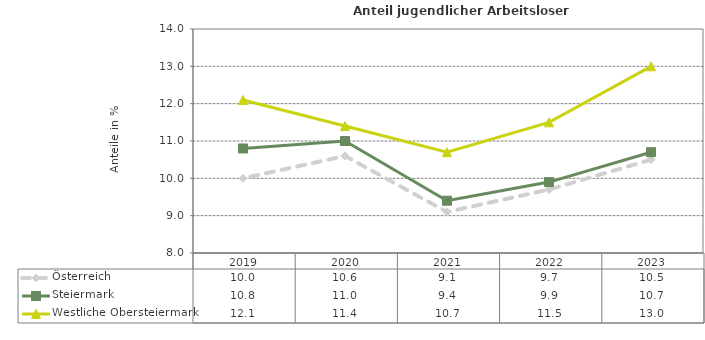
| Category | Österreich | Steiermark | Westliche Obersteiermark |
|---|---|---|---|
| 2023.0 | 10.5 | 10.7 | 13 |
| 2022.0 | 9.7 | 9.9 | 11.5 |
| 2021.0 | 9.1 | 9.4 | 10.7 |
| 2020.0 | 10.6 | 11 | 11.4 |
| 2019.0 | 10 | 10.8 | 12.1 |